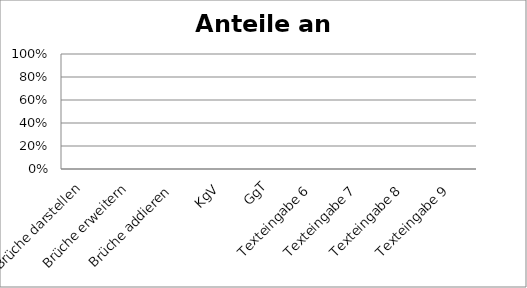
| Category | Series 0 |
|---|---|
| Brüche darstellen | 0 |
| Brüche erweitern | 0 |
| Brüche addieren | 0 |
| KgV | 0 |
| GgT | 0 |
| Texteingabe 6 | 0 |
| Texteingabe 7 | 0 |
| Texteingabe 8 | 0 |
| Texteingabe 9 | 0 |